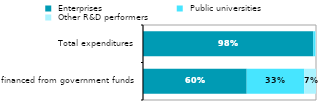
| Category |  Enterprises |  Public universities |  Other R&D performers |
|---|---|---|---|
| financed from government funds | 0.599 | 0.332 | 0.069 |
| Total expenditures | 0.984 | 0.012 | 0.003 |